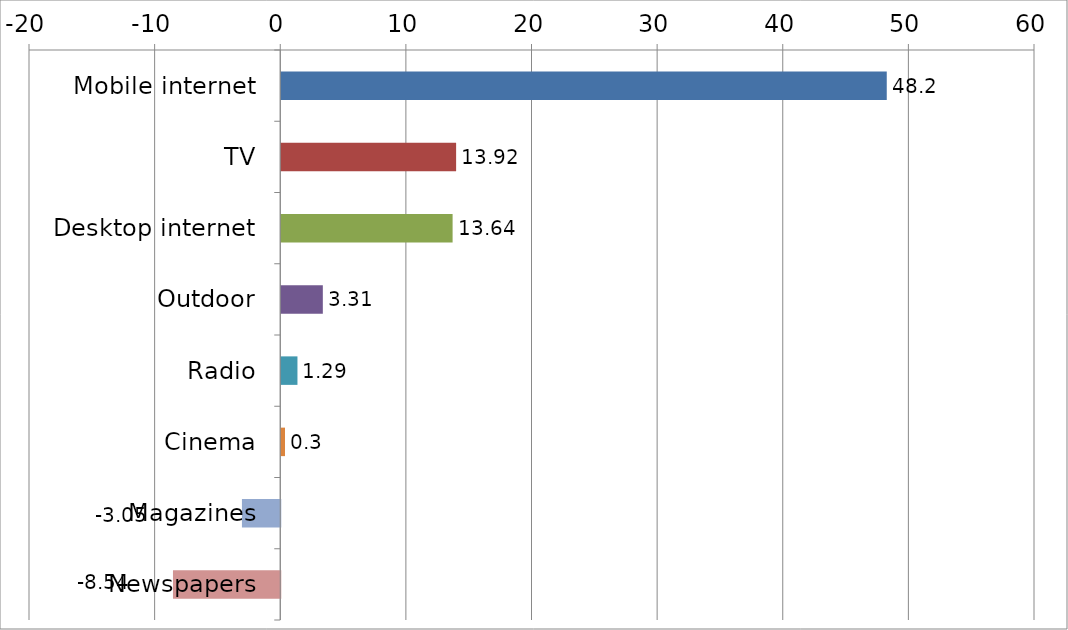
| Category | Series 0 |
|---|---|
| Mobile internet | 48.2 |
| TV | 13.92 |
| Desktop internet | 13.64 |
| Outdoor | 3.31 |
| Radio | 1.29 |
| Cinema | 0.3 |
| Magazines | -3.05 |
| Newspapers | -8.54 |